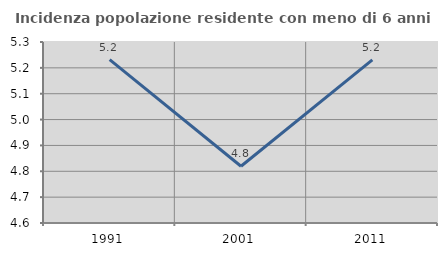
| Category | Incidenza popolazione residente con meno di 6 anni |
|---|---|
| 1991.0 | 5.232 |
| 2001.0 | 4.82 |
| 2011.0 | 5.231 |